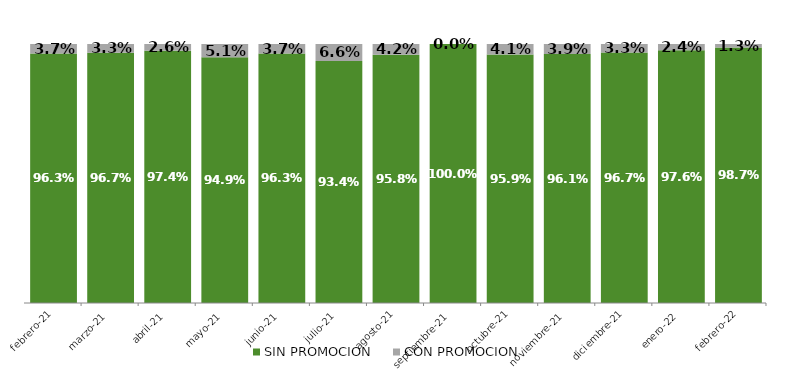
| Category | SIN PROMOCION   | CON PROMOCION   |
|---|---|---|
| 2021-02-01 | 0.963 | 0.037 |
| 2021-03-01 | 0.967 | 0.033 |
| 2021-04-01 | 0.974 | 0.026 |
| 2021-05-01 | 0.949 | 0.051 |
| 2021-06-01 | 0.963 | 0.037 |
| 2021-07-01 | 0.934 | 0.066 |
| 2021-08-01 | 0.958 | 0.042 |
| 2021-09-01 | 1 | 0 |
| 2021-10-01 | 0.959 | 0.041 |
| 2021-11-01 | 0.961 | 0.039 |
| 2021-12-01 | 0.967 | 0.033 |
| 2022-01-01 | 0.976 | 0.024 |
| 2022-02-01 | 0.987 | 0.013 |